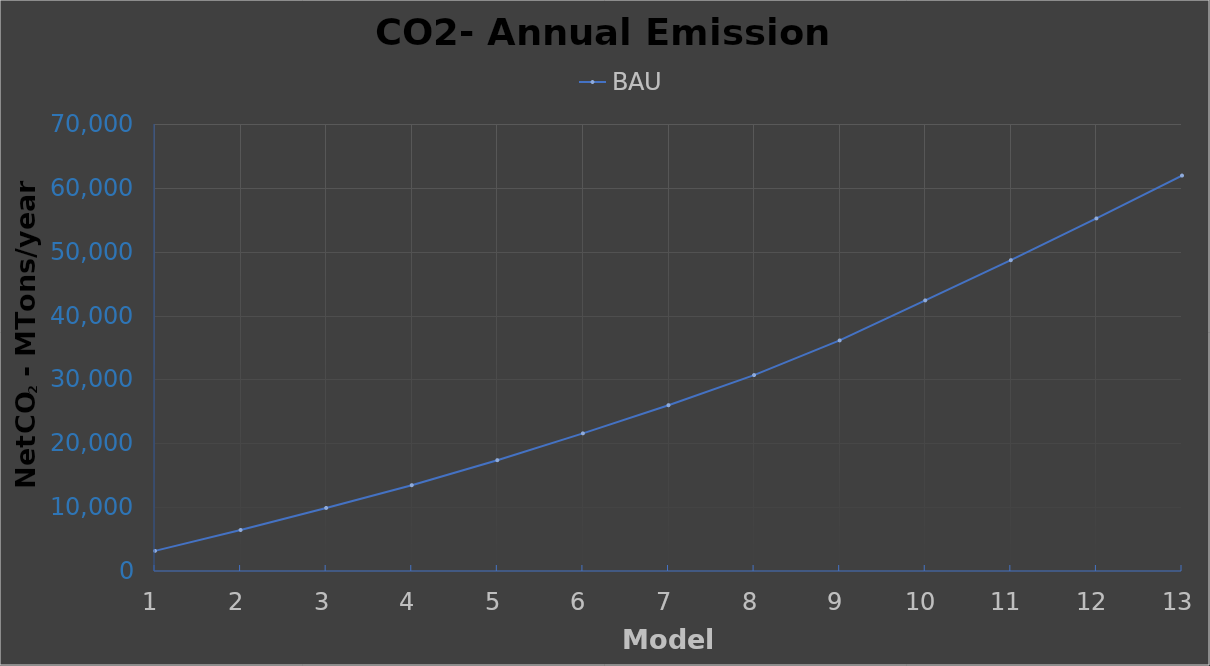
| Category | BAU |
|---|---|
| 0 | 3147.778 |
| 1 | 6419.417 |
| 2 | 9872.914 |
| 3 | 13434.001 |
| 4 | 17354.594 |
| 5 | 21553.379 |
| 6 | 25959.046 |
| 7 | 30682.374 |
| 8 | 36107.207 |
| 9 | 42375.443 |
| 10 | 48671.5 |
| 11 | 55213.392 |
| 12 | 61929.065 |